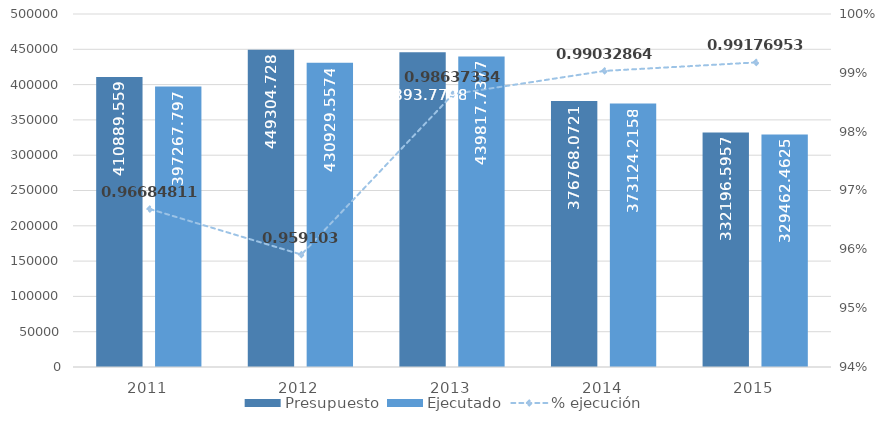
| Category | Presupuesto | Ejecutado |
|---|---|---|
| 2011.0 | 410889.559 | 397267.797 |
| 2012.0 | 449304.728 | 430929.557 |
| 2013.0 | 445893.78 | 439817.738 |
| 2014.0 | 376768.072 | 373124.216 |
| 2015.0 | 332196.596 | 329462.463 |